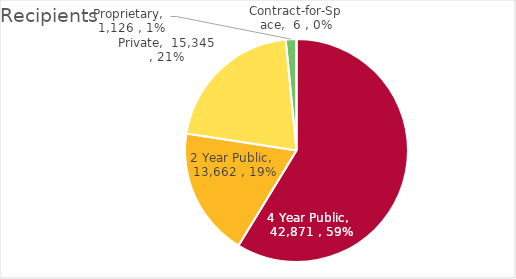
| Category | Series 0 | Series 1 |
|---|---|---|
| 4 Year Public | 42871 | 251793527.82 |
| 2 Year Public | 13662 | 29656089.63 |
| Private | 15345 | 99869797.9 |
| Proprietary | 1126 | 3154391.66 |
| Contract-for-Space | 6 | 20675 |